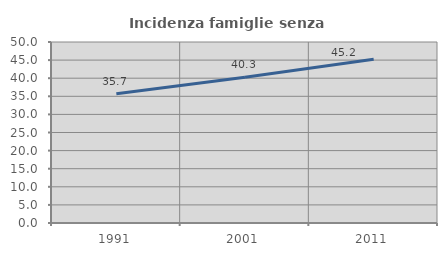
| Category | Incidenza famiglie senza nuclei |
|---|---|
| 1991.0 | 35.676 |
| 2001.0 | 40.27 |
| 2011.0 | 45.213 |